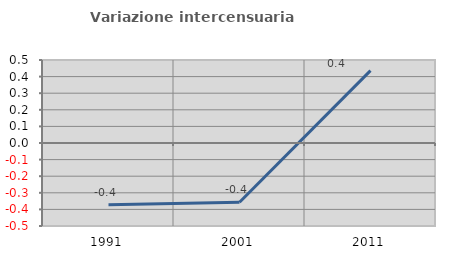
| Category | Variazione intercensuaria annua |
|---|---|
| 1991.0 | -0.372 |
| 2001.0 | -0.357 |
| 2011.0 | 0.436 |